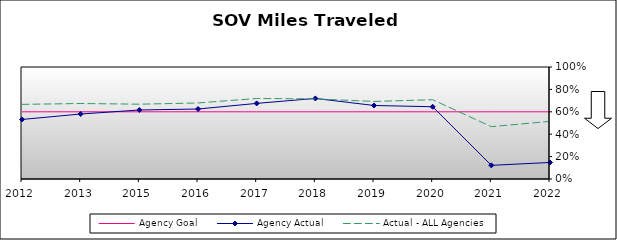
| Category | Agency Goal | Agency Actual | Actual - ALL Agencies |
|---|---|---|---|
| 2012.0 | 0.6 | 0.532 | 0.666 |
| 2013.0 | 0.6 | 0.58 | 0.674 |
| 2015.0 | 0.6 | 0.616 | 0.668 |
| 2016.0 | 0.6 | 0.625 | 0.679 |
| 2017.0 | 0.6 | 0.675 | 0.719 |
| 2018.0 | 0.6 | 0.719 | 0.715 |
| 2019.0 | 0.6 | 0.656 | 0.692 |
| 2020.0 | 0.6 | 0.645 | 0.708 |
| 2021.0 | 0.6 | 0.122 | 0.467 |
| 2022.0 | 0.6 | 0.148 | 0.515 |